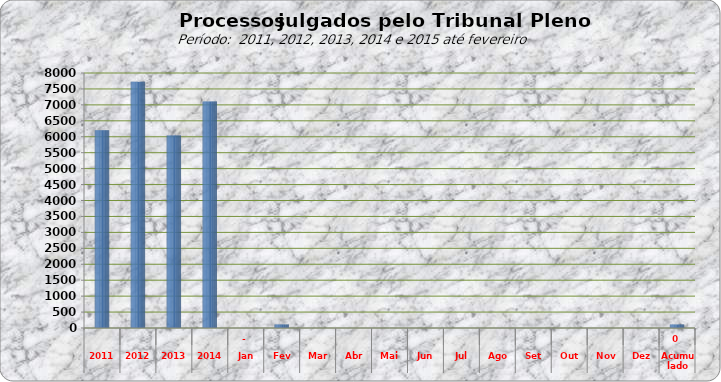
| Category | 6205 7722 6043  7.108  0 113 0 0 0 0 0 0 0 0 0 0 |
|---|---|
| 2011 | 6205 |
| 2012 | 7722 |
| 2013 | 6043 |
| 2014 | 7108 |
| Jan | 0 |
| Fev | 113 |
| Mar | 0 |
| Abr | 0 |
| Mai | 0 |
| Jun | 0 |
| Jul | 0 |
| Ago | 0 |
| Set | 0 |
| Out | 0 |
| Nov | 0 |
| Dez | 0 |
| Acumulado | 113 |